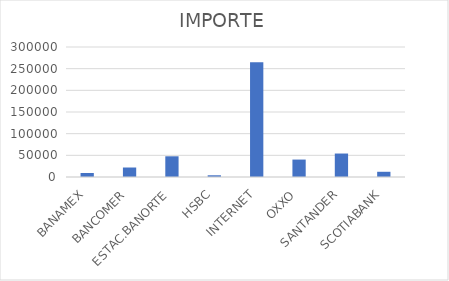
| Category | IMPORTE |
|---|---|
| BANAMEX | 9269.75 |
| BANCOMER | 21901.43 |
| ESTAC.BANORTE | 47780 |
| HSBC | 3961 |
| INTERNET | 264716.71 |
| OXXO | 40223.13 |
| SANTANDER | 54163.19 |
| SCOTIABANK | 12044.42 |